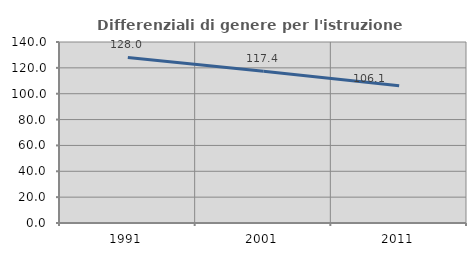
| Category | Differenziali di genere per l'istruzione superiore |
|---|---|
| 1991.0 | 128.049 |
| 2001.0 | 117.447 |
| 2011.0 | 106.114 |